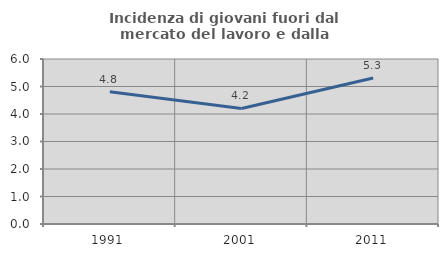
| Category | Incidenza di giovani fuori dal mercato del lavoro e dalla formazione  |
|---|---|
| 1991.0 | 4.808 |
| 2001.0 | 4.202 |
| 2011.0 | 5.31 |